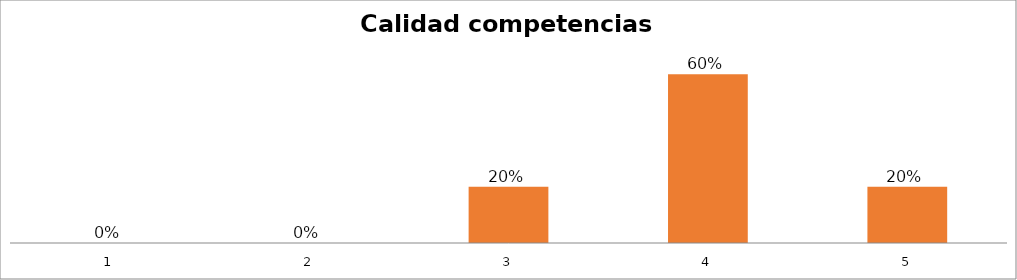
| Category | Series 1 |
|---|---|
| 0 | 0 |
| 1 | 0 |
| 2 | 0.2 |
| 3 | 0.6 |
| 4 | 0.2 |